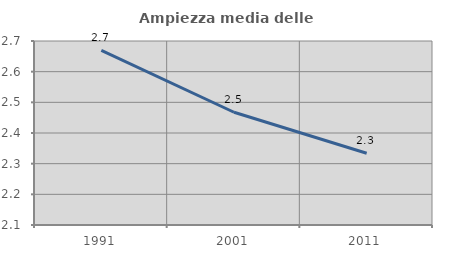
| Category | Ampiezza media delle famiglie |
|---|---|
| 1991.0 | 2.67 |
| 2001.0 | 2.468 |
| 2011.0 | 2.334 |